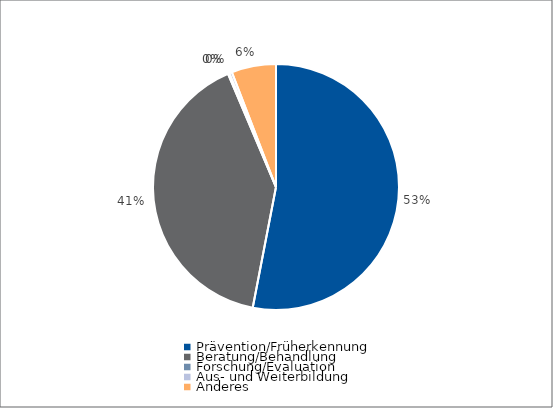
| Category | Series 0 |
|---|---|
| Prävention/Früherkennung | 94086.39 |
| Beratung/Behandlung | 72000 |
| Forschung/Evaluation | 321.5 |
| Aus- und Weiterbildung | 640.43 |
| Anderes | 10365.57 |